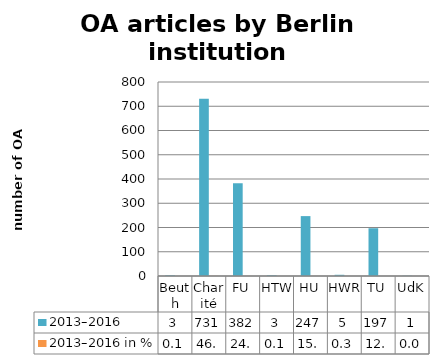
| Category | 2013–2016 | 2013–2016 in % |
|---|---|---|
| Beuth | 3 | 0.002 |
| Charité | 731 | 0.466 |
| FU | 382 | 0.243 |
| HTW | 3 | 0.002 |
| HU | 247 | 0.157 |
| HWR | 5 | 0.003 |
| TU | 197 | 0.126 |
| UdK | 1 | 0.001 |